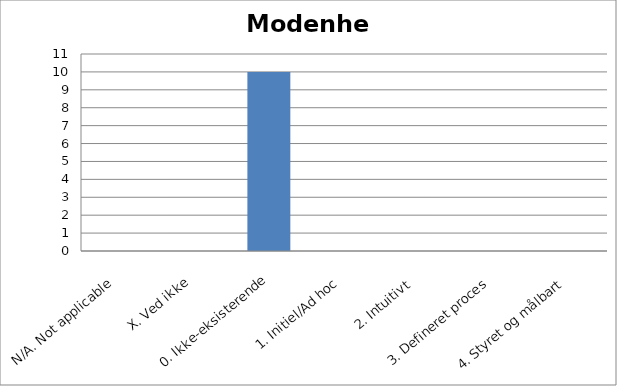
| Category | Count |
|---|---|
| N/A. Not applicable | 0 |
| X. Ved ikke | 0 |
| 0. Ikke-eksisterende | 10 |
| 1. Initiel/Ad hoc | 0 |
| 2. Intuitivt  | 0 |
| 3. Defineret proces | 0 |
| 4. Styret og målbart | 0 |